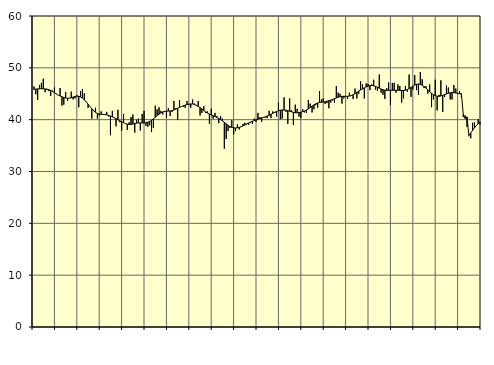
| Category | Piggar | Series 1 |
|---|---|---|
| nan | 46.4 | 45.81 |
| 1.0 | 44.9 | 45.89 |
| 1.0 | 43.8 | 45.94 |
| 1.0 | 46.7 | 45.95 |
| 1.0 | 47.1 | 45.97 |
| 1.0 | 47.9 | 45.95 |
| 1.0 | 45.3 | 45.94 |
| 1.0 | 45.7 | 45.88 |
| 1.0 | 45.5 | 45.79 |
| 1.0 | 44.6 | 45.63 |
| 1.0 | 45.6 | 45.43 |
| 1.0 | 46.2 | 45.19 |
| nan | 45 | 44.95 |
| 2.0 | 44.7 | 44.74 |
| 2.0 | 46.1 | 44.57 |
| 2.0 | 42.7 | 44.42 |
| 2.0 | 42.9 | 44.29 |
| 2.0 | 45.3 | 44.19 |
| 2.0 | 43.6 | 44.14 |
| 2.0 | 44.1 | 44.15 |
| 2.0 | 45.4 | 44.23 |
| 2.0 | 43.9 | 44.36 |
| 2.0 | 44.1 | 44.47 |
| 2.0 | 44.7 | 44.54 |
| nan | 42.4 | 44.52 |
| 3.0 | 45.5 | 44.4 |
| 3.0 | 45.9 | 44.17 |
| 3.0 | 45.1 | 43.84 |
| 3.0 | 43.5 | 43.44 |
| 3.0 | 42.3 | 42.99 |
| 3.0 | 42.5 | 42.53 |
| 3.0 | 40.2 | 42.1 |
| 3.0 | 41.9 | 41.71 |
| 3.0 | 42.3 | 41.41 |
| 3.0 | 40.2 | 41.2 |
| 3.0 | 40.8 | 41.08 |
| nan | 41.6 | 41.03 |
| 4.0 | 41 | 41.02 |
| 4.0 | 41.1 | 40.99 |
| 4.0 | 41.5 | 40.93 |
| 4.0 | 40.6 | 40.84 |
| 4.0 | 37 | 40.71 |
| 4.0 | 41.7 | 40.54 |
| 4.0 | 40.4 | 40.37 |
| 4.0 | 38.7 | 40.18 |
| 4.0 | 41.9 | 39.98 |
| 4.0 | 39.5 | 39.78 |
| 4.0 | 37.9 | 39.6 |
| nan | 41.1 | 39.41 |
| 5.0 | 39.2 | 39.25 |
| 5.0 | 38 | 39.13 |
| 5.0 | 39.5 | 39.07 |
| 5.0 | 40.5 | 39.09 |
| 5.0 | 41 | 39.16 |
| 5.0 | 37.5 | 39.26 |
| 5.0 | 40 | 39.33 |
| 5.0 | 40.2 | 39.37 |
| 5.0 | 37.9 | 39.38 |
| 5.0 | 41.1 | 39.36 |
| 5.0 | 41.7 | 39.36 |
| nan | 38.8 | 39.4 |
| 6.0 | 38.6 | 39.5 |
| 6.0 | 38.9 | 39.66 |
| 6.0 | 37.6 | 39.89 |
| 6.0 | 38.4 | 40.16 |
| 6.0 | 42.7 | 40.45 |
| 6.0 | 42 | 40.77 |
| 6.0 | 42.4 | 41.06 |
| 6.0 | 41.7 | 41.31 |
| 6.0 | 41 | 41.49 |
| 6.0 | 41.5 | 41.6 |
| 6.0 | 40.4 | 41.65 |
| nan | 42.2 | 41.66 |
| 7.0 | 40.7 | 41.68 |
| 7.0 | 41.5 | 41.75 |
| 7.0 | 43.6 | 41.87 |
| 7.0 | 42.2 | 42.03 |
| 7.0 | 40 | 42.2 |
| 7.0 | 43.8 | 42.37 |
| 7.0 | 42.5 | 42.53 |
| 7.0 | 42.5 | 42.68 |
| 7.0 | 42.3 | 42.81 |
| 7.0 | 43.6 | 42.91 |
| 7.0 | 42.8 | 43 |
| nan | 42.3 | 43.04 |
| 8.0 | 43.9 | 43.02 |
| 8.0 | 43.1 | 42.94 |
| 8.0 | 42.7 | 42.78 |
| 8.0 | 43.6 | 42.57 |
| 8.0 | 40.8 | 42.32 |
| 8.0 | 41.3 | 42.06 |
| 8.0 | 42.6 | 41.78 |
| 8.0 | 41.3 | 41.51 |
| 8.0 | 41.6 | 41.28 |
| 8.0 | 39.2 | 41.08 |
| 8.0 | 42.1 | 40.9 |
| nan | 40.2 | 40.75 |
| 9.0 | 41.3 | 40.6 |
| 9.0 | 40.7 | 40.43 |
| 9.0 | 39.3 | 40.24 |
| 9.0 | 40.7 | 40.02 |
| 9.0 | 40.2 | 39.76 |
| 9.0 | 34.4 | 39.48 |
| 9.0 | 36.3 | 39.19 |
| 9.0 | 37.8 | 38.92 |
| 9.0 | 38.4 | 38.69 |
| 9.0 | 39.9 | 38.53 |
| 9.0 | 37.2 | 38.43 |
| nan | 37.8 | 38.4 |
| 10.0 | 39.1 | 38.43 |
| 10.0 | 38.1 | 38.51 |
| 10.0 | 38.7 | 38.63 |
| 10.0 | 39.2 | 38.78 |
| 10.0 | 39.4 | 38.96 |
| 10.0 | 39.2 | 39.14 |
| 10.0 | 39 | 39.33 |
| 10.0 | 39.4 | 39.51 |
| 10.0 | 39.2 | 39.68 |
| 10.0 | 40.2 | 39.83 |
| 10.0 | 39.6 | 39.97 |
| nan | 41.3 | 40.1 |
| 11.0 | 40.5 | 40.22 |
| 11.0 | 39.6 | 40.34 |
| 11.0 | 40.4 | 40.45 |
| 11.0 | 40.4 | 40.57 |
| 11.0 | 40.3 | 40.71 |
| 11.0 | 41.7 | 40.87 |
| 11.0 | 40.3 | 41.04 |
| 11.0 | 41.6 | 41.23 |
| 11.0 | 41.3 | 41.42 |
| 11.0 | 40.6 | 41.59 |
| 11.0 | 43.3 | 41.73 |
| nan | 40.1 | 41.82 |
| 12.0 | 40.2 | 41.87 |
| 12.0 | 44.3 | 41.86 |
| 12.0 | 41.5 | 41.83 |
| 12.0 | 39.2 | 41.74 |
| 12.0 | 44.1 | 41.63 |
| 12.0 | 41.8 | 41.51 |
| 12.0 | 39 | 41.41 |
| 12.0 | 42.9 | 41.34 |
| 12.0 | 42.1 | 41.33 |
| 12.0 | 40.6 | 41.36 |
| 12.0 | 40.3 | 41.43 |
| nan | 42 | 41.53 |
| 13.0 | 41.4 | 41.67 |
| 13.0 | 41.3 | 41.86 |
| 13.0 | 43.8 | 42.08 |
| 13.0 | 43.1 | 42.34 |
| 13.0 | 41.4 | 42.61 |
| 13.0 | 42 | 42.85 |
| 13.0 | 42.8 | 43.06 |
| 13.0 | 42.3 | 43.21 |
| 13.0 | 45.5 | 43.3 |
| 13.0 | 43.9 | 43.35 |
| 13.0 | 44.1 | 43.4 |
| nan | 43 | 43.47 |
| 14.0 | 43.2 | 43.55 |
| 14.0 | 42.2 | 43.66 |
| 14.0 | 43.3 | 43.77 |
| 14.0 | 43.7 | 43.9 |
| 14.0 | 43.3 | 44.04 |
| 14.0 | 46.5 | 44.19 |
| 14.0 | 45.2 | 44.34 |
| 14.0 | 45 | 44.44 |
| 14.0 | 43.1 | 44.5 |
| 14.0 | 44.1 | 44.5 |
| 14.0 | 44.6 | 44.5 |
| nan | 44 | 44.5 |
| 15.0 | 45.2 | 44.55 |
| 15.0 | 44.6 | 44.65 |
| 15.0 | 44 | 44.82 |
| 15.0 | 46 | 45.03 |
| 15.0 | 44.1 | 45.27 |
| 15.0 | 45 | 45.51 |
| 15.0 | 47.4 | 45.74 |
| 15.0 | 46.8 | 45.95 |
| 15.0 | 44.1 | 46.15 |
| 15.0 | 47 | 46.34 |
| 15.0 | 46.9 | 46.48 |
| nan | 45.7 | 46.57 |
| 16.0 | 46.8 | 46.59 |
| 16.0 | 47.7 | 46.54 |
| 16.0 | 45.8 | 46.42 |
| 16.0 | 45.6 | 46.26 |
| 16.0 | 48.7 | 46.08 |
| 16.0 | 45.2 | 45.91 |
| 16.0 | 44.8 | 45.78 |
| 16.0 | 44 | 45.69 |
| 16.0 | 46.1 | 45.65 |
| 16.0 | 47.2 | 45.64 |
| 16.0 | 42.8 | 45.65 |
| nan | 47.1 | 45.67 |
| 17.0 | 47.1 | 45.68 |
| 17.0 | 45.2 | 45.67 |
| 17.0 | 46.8 | 45.67 |
| 17.0 | 46.5 | 45.65 |
| 17.0 | 43.3 | 45.64 |
| 17.0 | 44.1 | 45.64 |
| 17.0 | 46.5 | 45.69 |
| 17.0 | 45.4 | 45.81 |
| 17.0 | 48.7 | 45.99 |
| 17.0 | 44.4 | 46.21 |
| 17.0 | 45.8 | 46.46 |
| nan | 48.6 | 46.68 |
| 18.0 | 45.7 | 46.83 |
| 18.0 | 44.8 | 46.88 |
| 18.0 | 49.2 | 46.81 |
| 18.0 | 47.8 | 46.64 |
| 18.0 | 46.1 | 46.39 |
| 18.0 | 46.5 | 46.1 |
| 18.0 | 45 | 45.76 |
| 18.0 | 46.8 | 45.4 |
| 18.0 | 42.4 | 45.08 |
| 18.0 | 43.9 | 44.81 |
| 18.0 | 47.7 | 44.63 |
| nan | 41.8 | 44.52 |
| 19.0 | 44.8 | 44.51 |
| 19.0 | 47.6 | 44.57 |
| 19.0 | 41.5 | 44.69 |
| 19.0 | 44.4 | 44.83 |
| 19.0 | 46.6 | 44.96 |
| 19.0 | 46.2 | 45.09 |
| 19.0 | 43.9 | 45.18 |
| 19.0 | 43.9 | 45.22 |
| 19.0 | 46.7 | 45.2 |
| 19.0 | 46 | 45.14 |
| 19.0 | 45.1 | 45.07 |
| nan | 45.5 | 45 |
| 20.0 | 44.3 | 45 |
| 20.0 | 40.5 | 41.06 |
| 20.0 | 40.8 | 40.22 |
| 20.0 | 38.6 | 40.54 |
| 20.0 | 36.8 | 36.96 |
| 20.0 | 36.4 | 37.43 |
| 20.0 | 39.4 | 37.94 |
| 20.0 | 39.5 | 38.43 |
| 20.0 | 38.9 | 38.88 |
| 20.0 | 40.1 | 39.23 |
| 20.0 | 39.1 | 39.49 |